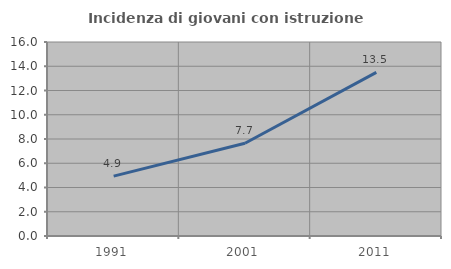
| Category | Incidenza di giovani con istruzione universitaria |
|---|---|
| 1991.0 | 4.941 |
| 2001.0 | 7.654 |
| 2011.0 | 13.49 |